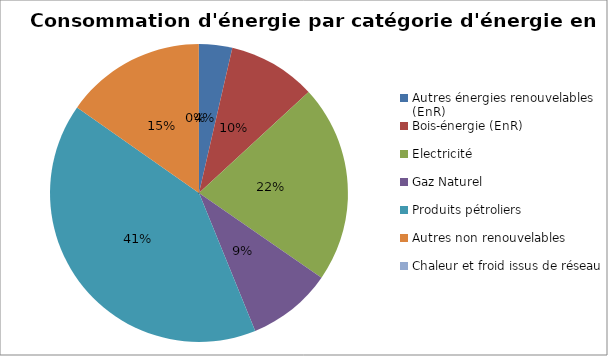
| Category | Series 0 |
|---|---|
| Autres énergies renouvelables (EnR) | 76819.932 |
| Bois-énergie (EnR) | 203961.637 |
| Electricité | 458725.991 |
| Gaz Naturel | 196562.522 |
| Produits pétroliers | 873229.479 |
| Autres non renouvelables | 325512.567 |
| Chaleur et froid issus de réseau | 225 |